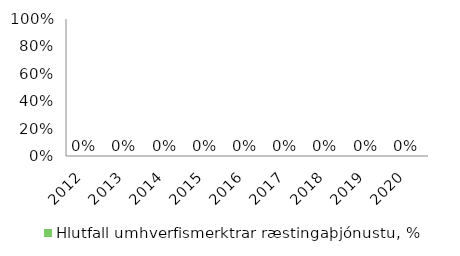
| Category | Hlutfall umhverfismerktrar ræstingaþjónustu, % |
|---|---|
| 2012.0 | 0 |
| 2013.0 | 0 |
| 2014.0 | 0 |
| 2015.0 | 0 |
| 2016.0 | 0 |
| 2017.0 | 0 |
| 2018.0 | 0 |
| 2019.0 | 0 |
| 2020.0 | 0 |